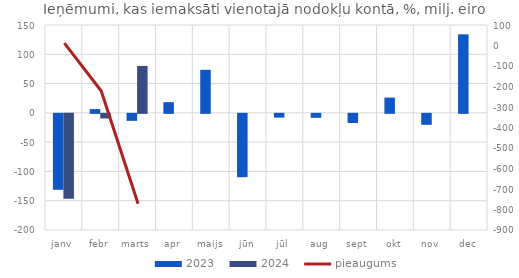
| Category | 2023 | 2024 |
|---|---|---|
| janv | -129.655 | -144.84 |
| febr | 6.432 | -7.853 |
| marts | -11.924 | 80.097 |
| apr | 18.271 | 0 |
| maijs | 73.488 | 0 |
| jūn | -108.101 | 0 |
| jūl | -6.389 | 0 |
| aug | -6.777 | 0 |
| sept | -15.613 | 0 |
| okt | 26.046 | 0 |
| nov | -18.673 | 0 |
| dec | 134.083 | 0 |